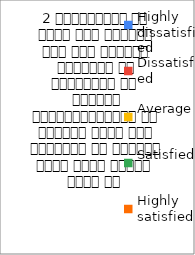
| Category | 2 व्याख्यान से रूचि में वृद्धि हुई एवं शिक्षण जानकारी से परिपूर्ण था 
शिक्षक विद्यार्थियों के द्वारा पूछे गये प्रश्नो का समाधान करने हेतु तत्पर  रहते है  |
|---|---|
| Highly dissatisfied | 0 |
| Dissatisfied | 0 |
| Average | 0 |
| Satisfied | 3 |
| Highly satisfied | 3 |